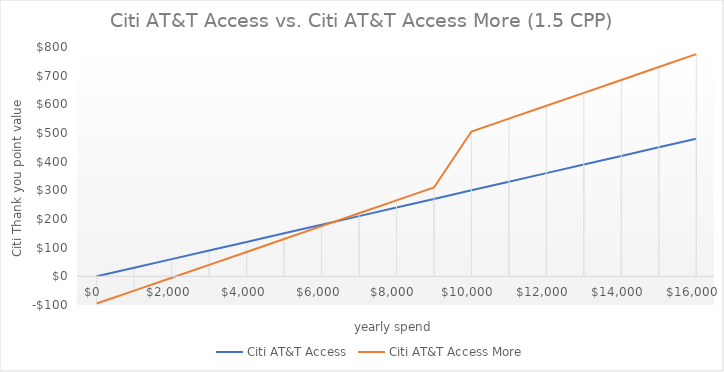
| Category | Citi AT&T Access | Citi AT&T Access More |
|---|---|---|
| 0.0 | 0 | -95 |
| 1000.0 | 30 | -50 |
| 2000.0 | 60 | -5 |
| 3000.0 | 90 | 40 |
| 4000.0 | 120 | 85 |
| 5000.0 | 150 | 130 |
| 6000.0 | 180 | 175 |
| 7000.0 | 210 | 220 |
| 8000.0 | 240 | 265 |
| 9000.0 | 270 | 310 |
| 10000.0 | 300 | 505 |
| 11000.0 | 330 | 550 |
| 12000.0 | 360 | 595 |
| 13000.0 | 390 | 640 |
| 14000.0 | 420 | 685 |
| 15000.0 | 450 | 730 |
| 16000.0 | 480 | 775 |